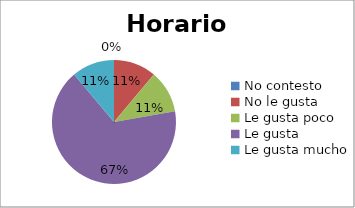
| Category | Series 0 |
|---|---|
| No contesto | 0 |
| No le gusta | 1 |
| Le gusta poco | 1 |
| Le gusta | 6 |
| Le gusta mucho | 1 |